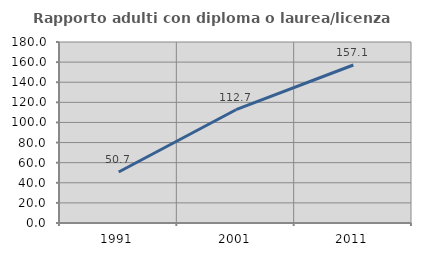
| Category | Rapporto adulti con diploma o laurea/licenza media  |
|---|---|
| 1991.0 | 50.746 |
| 2001.0 | 112.658 |
| 2011.0 | 157.143 |